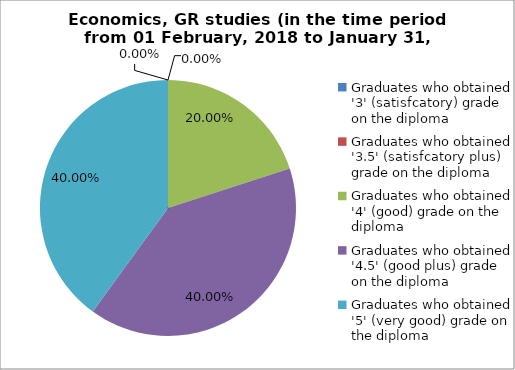
| Category | Series 0 |
|---|---|
| Graduates who obtained '3' (satisfcatory) grade on the diploma | 0 |
| Graduates who obtained '3.5' (satisfcatory plus) grade on the diploma | 0 |
| Graduates who obtained '4' (good) grade on the diploma | 20 |
| Graduates who obtained '4.5' (good plus) grade on the diploma | 40 |
| Graduates who obtained '5' (very good) grade on the diploma | 40 |